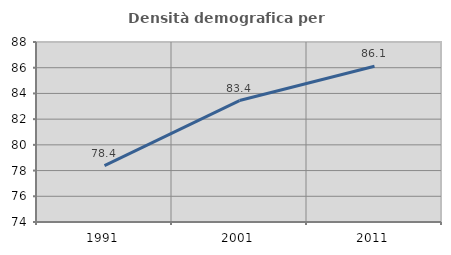
| Category | Densità demografica |
|---|---|
| 1991.0 | 78.392 |
| 2001.0 | 83.445 |
| 2011.0 | 86.116 |